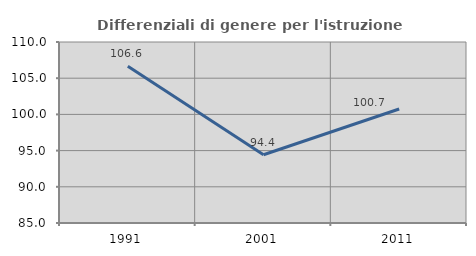
| Category | Differenziali di genere per l'istruzione superiore |
|---|---|
| 1991.0 | 106.65 |
| 2001.0 | 94.423 |
| 2011.0 | 100.742 |